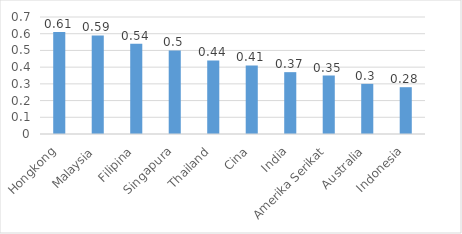
| Category | Series 0 |
|---|---|
| Hongkong | 0.61 |
| Malaysia | 0.59 |
| Filipina | 0.54 |
| Singapura | 0.5 |
| Thailand | 0.44 |
| Cina | 0.41 |
| India | 0.37 |
| Amerika Serikat | 0.35 |
| Australia | 0.3 |
| Indonesia | 0.28 |